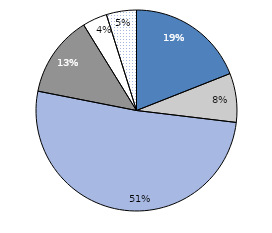
| Category | Series 0 |
|---|---|
| Student summer programme | 19.013 |
| PWP | 7.886 |
| Other Empl. measure | 51.185 |
| Other YG measure | 13.111 |
| Subsidy | 3.967 |
| No other measure | 4.838 |